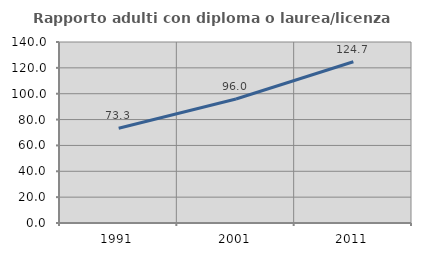
| Category | Rapporto adulti con diploma o laurea/licenza media  |
|---|---|
| 1991.0 | 73.269 |
| 2001.0 | 95.953 |
| 2011.0 | 124.739 |